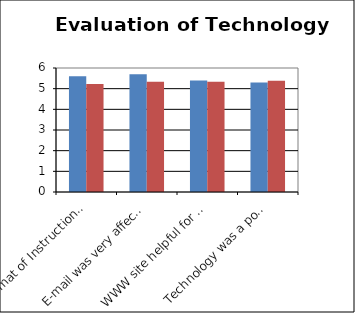
| Category | My Avg. | Univ. Avg. |
|---|---|---|
| Format of Instructions was affective | 5.6 | 5.22 |
| E-mail was very affective | 5.7 | 5.34 |
| WWW site helpful for course | 5.4 | 5.34 |
| Technology was a positve challenge | 5.3 | 5.38 |